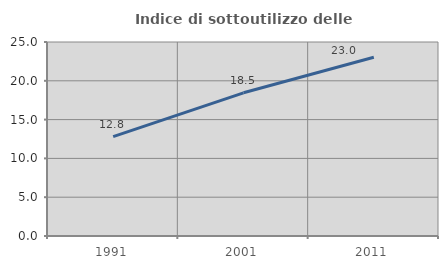
| Category | Indice di sottoutilizzo delle abitazioni  |
|---|---|
| 1991.0 | 12.803 |
| 2001.0 | 18.451 |
| 2011.0 | 23.031 |